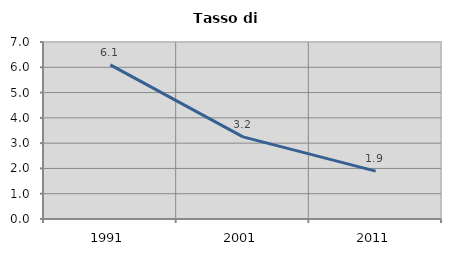
| Category | Tasso di disoccupazione   |
|---|---|
| 1991.0 | 6.098 |
| 2001.0 | 3.247 |
| 2011.0 | 1.892 |